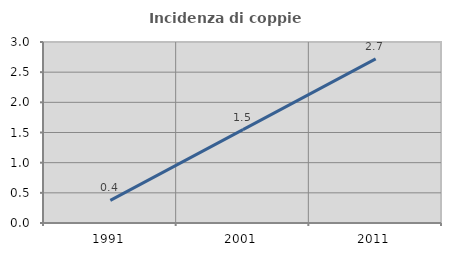
| Category | Incidenza di coppie miste |
|---|---|
| 1991.0 | 0.375 |
| 2001.0 | 1.547 |
| 2011.0 | 2.72 |